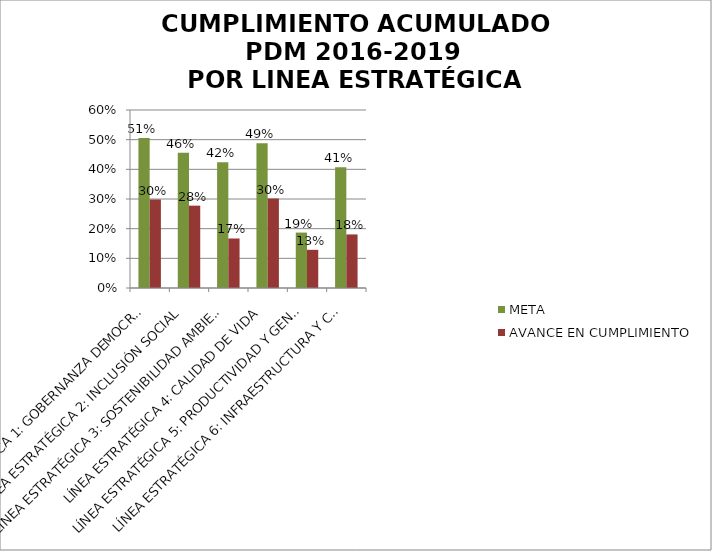
| Category | META | AVANCE EN CUMPLIMIENTO |
|---|---|---|
| LÍNEA ESTRATÉGICA 1: GOBERNANZA DEMOCRÁTICA | 0.506 | 0.298 |
| LÍNEA ESTRATÉGICA 2: INCLUSIÓN SOCIAL | 0.456 | 0.278 |
| LÍNEA ESTRATÉGICA 3: SOSTENIBILIDAD AMBIENTAL | 0.424 | 0.167 |
| LÍNEA ESTRATÉGICA 4: CALIDAD DE VIDA | 0.488 | 0.302 |
| LÍNEA ESTRATÉGICA 5: PRODUCTIVIDAD Y GENERACIÓN DE OPORTUNIDADES | 0.187 | 0.129 |
| LÍNEA ESTRATÉGICA 6: INFRAESTRUCTURA Y CONECTIVIDAD | 0.407 | 0.181 |